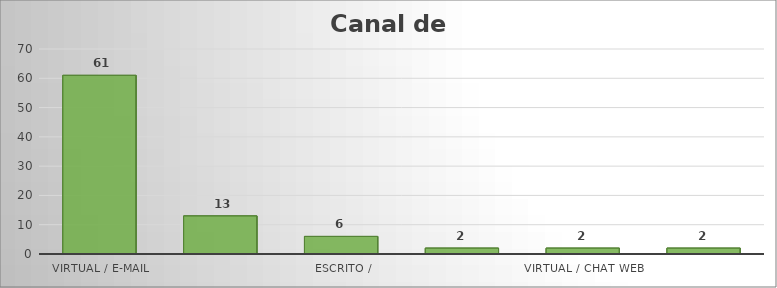
| Category | Series 0 |
|---|---|
| VIRTUAL / E-MAIL | 61 |
| VIRTUAL / BOGOTÁ TE ESCUCHA | 13 |
| ESCRITO / VENTANILLA CORRESPONDENCIA | 6 |
| PRESENCIAL / OFICINA | 2 |
| VIRTUAL / CHAT WEB | 2 |
| TELEFÓNICO | 2 |